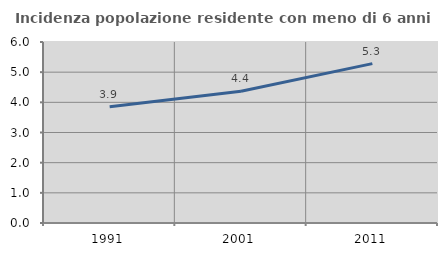
| Category | Incidenza popolazione residente con meno di 6 anni |
|---|---|
| 1991.0 | 3.857 |
| 2001.0 | 4.369 |
| 2011.0 | 5.283 |